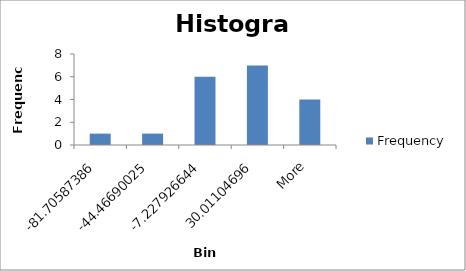
| Category | Frequency |
|---|---|
| -81.70587386 | 1 |
| -44.46690025 | 1 |
| -7.227926644 | 6 |
| 30.01104696 | 7 |
| More | 4 |